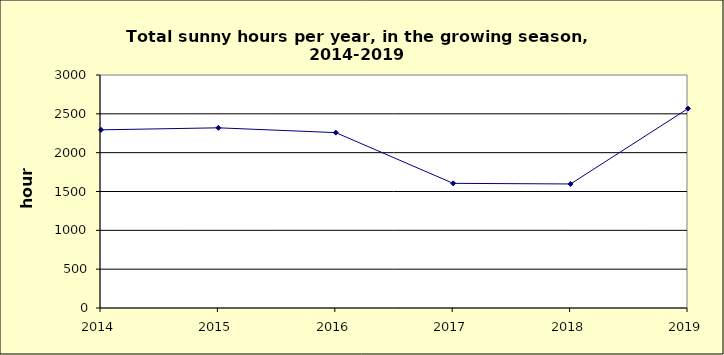
| Category | Series 0 |
|---|---|
| 2014.0 | 2294 |
| 2015.0 | 2320 |
| 2016.0 | 2258 |
| 2017.0 | 1605 |
| 2018.0 | 1597 |
| 2019.0 | 2568 |